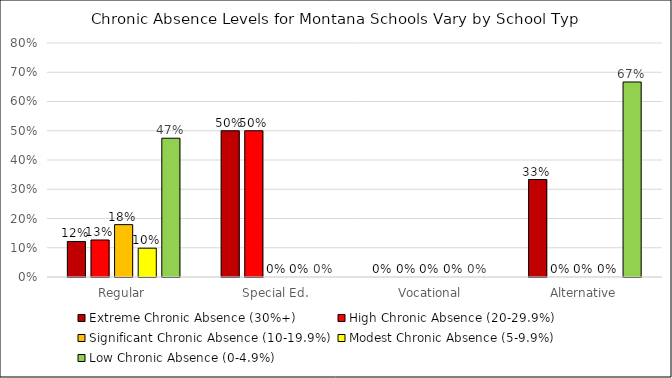
| Category | Extreme Chronic Absence (30%+) | High Chronic Absence (20-29.9%) | Significant Chronic Absence (10-19.9%) | Modest Chronic Absence (5-9.9%) | Low Chronic Absence (0-4.9%) |
|---|---|---|---|---|---|
| Regular | 0.121 | 0.127 | 0.179 | 0.098 | 0.474 |
| Special Ed. | 0.5 | 0.5 | 0 | 0 | 0 |
| Vocational | 0 | 0 | 0 | 0 | 0 |
| Alternative | 0.333 | 0 | 0 | 0 | 0.667 |